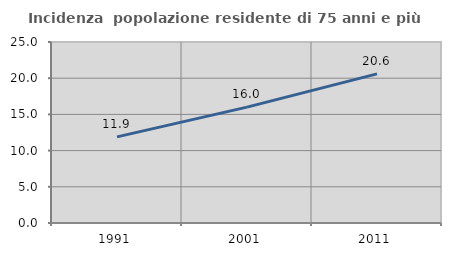
| Category | Incidenza  popolazione residente di 75 anni e più |
|---|---|
| 1991.0 | 11.896 |
| 2001.0 | 16.009 |
| 2011.0 | 20.603 |